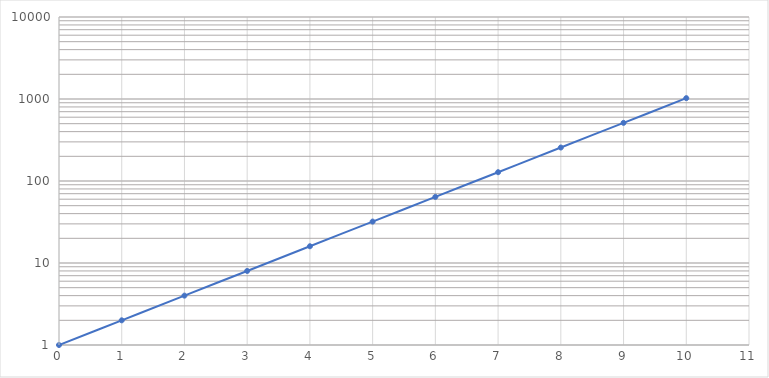
| Category | f(x) |
|---|---|
| 0.0 | 1 |
| 1.0 | 2 |
| 2.0 | 4 |
| 3.0 | 8 |
| 4.0 | 16 |
| 5.0 | 32 |
| 6.0 | 64 |
| 7.0 | 128 |
| 8.0 | 256 |
| 9.0 | 512 |
| 10.0 | 1024 |